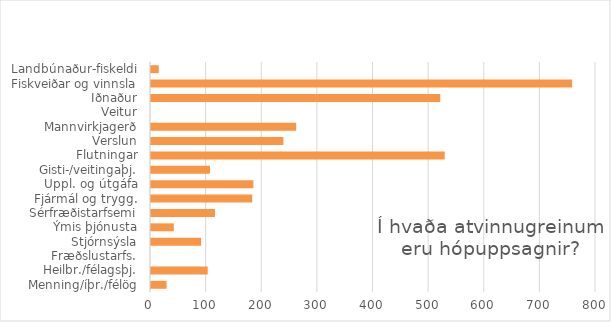
| Category | Series 0 |
|---|---|
| Landbúnaður-fiskeldi | 14 |
| Fiskveiðar og vinnsla | 757 |
| Iðnaður | 520 |
| Veitur | 0 |
| Mannvirkjagerð | 261 |
| Verslun | 238 |
| Flutningar | 528 |
| Gisti-/veitingaþj. | 106 |
| Uppl. og útgáfa | 184 |
| Fjármál og trygg. | 182 |
| Sérfræðistarfsemi | 115 |
| Ýmis þjónusta | 41 |
| Stjórnsýsla | 90 |
| Fræðslustarfs. | 0 |
| Heilbr./félagsþj. | 102 |
| Menning/íþr./félög | 28 |